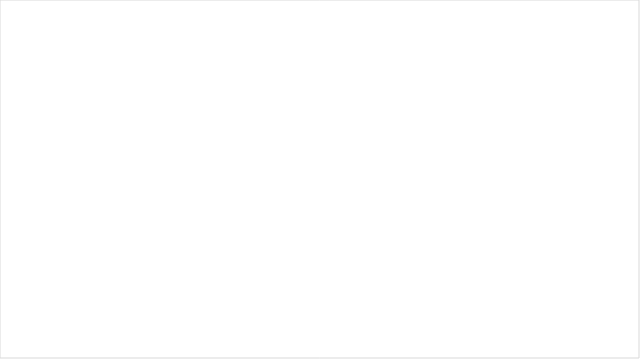
| Category | 0,00% |
|---|---|
| 0,00% | 0 |
|  | 0 |
|  | 0 |
|  | 0 |
|  | 0 |
|  | 0 |
|  | 0 |
|  | 0 |
|  | 0 |
|  | 0 |
| Otras | 0 |